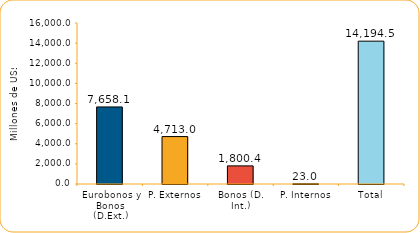
| Category | Series 1 |
|---|---|
| Eurobonos y Bonos (D.Ext.) | 7658.1 |
| P. Externos | 4713 |
| Bonos (D. Int.) | 1800.4 |
| P. Internos | 23 |
| Total | 14194.5 |